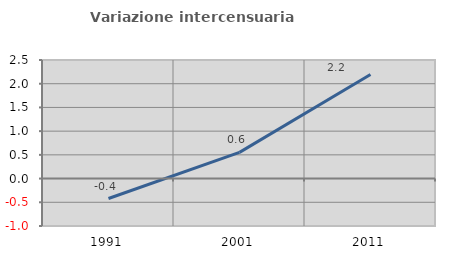
| Category | Variazione intercensuaria annua |
|---|---|
| 1991.0 | -0.421 |
| 2001.0 | 0.553 |
| 2011.0 | 2.195 |